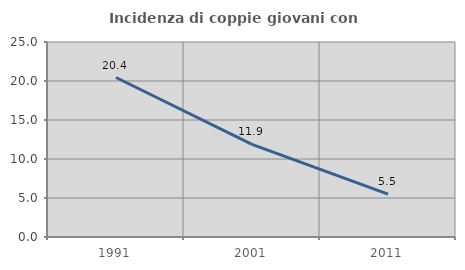
| Category | Incidenza di coppie giovani con figli |
|---|---|
| 1991.0 | 20.447 |
| 2001.0 | 11.864 |
| 2011.0 | 5.493 |